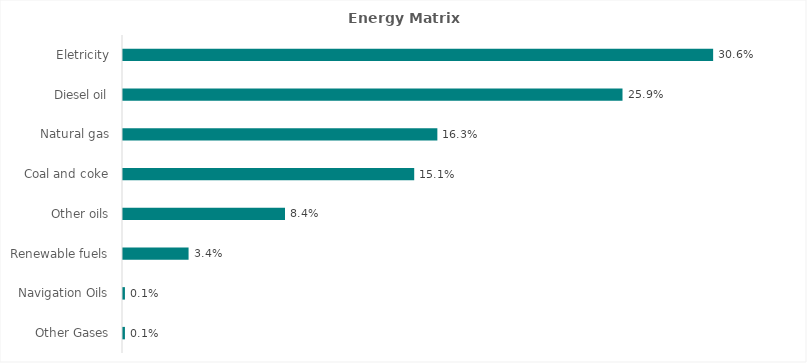
| Category | 2023 |
|---|---|
| Eletricity | 0.306 |
| Diesel oil | 0.259 |
| Natural gas | 0.163 |
| Coal and coke | 0.151 |
| Other oils | 0.084 |
| Renewable fuels | 0.034 |
| Navigation Oils | 0.001 |
| Other Gases | 0.001 |